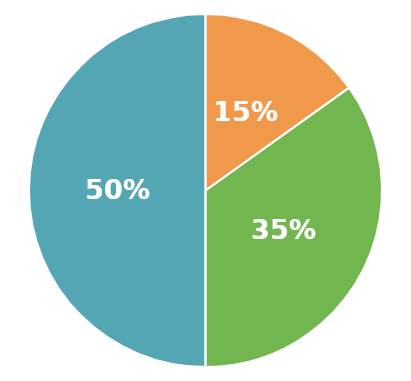
| Category | Series 0 |
|---|---|
| Składniki majątku razem | 1902500 |
| Zadłużenie razem | 575000 |
| Majątek netto | 1327500 |